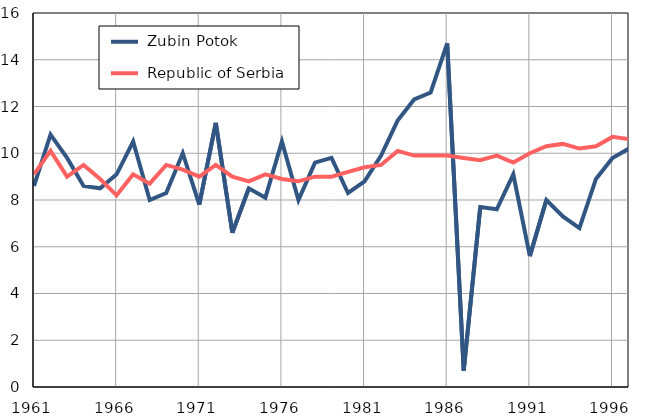
| Category |  Zubin Potok |  Republic of Serbia |
|---|---|---|
| 1961.0 | 8.6 | 9.1 |
| 1962.0 | 10.8 | 10.1 |
| 1963.0 | 9.8 | 9 |
| 1964.0 | 8.6 | 9.5 |
| 1965.0 | 8.5 | 8.9 |
| 1966.0 | 9.1 | 8.2 |
| 1967.0 | 10.5 | 9.1 |
| 1968.0 | 8 | 8.7 |
| 1969.0 | 8.3 | 9.5 |
| 1970.0 | 10 | 9.3 |
| 1971.0 | 7.8 | 9 |
| 1972.0 | 11.3 | 9.5 |
| 1973.0 | 6.6 | 9 |
| 1974.0 | 8.5 | 8.8 |
| 1975.0 | 8.1 | 9.1 |
| 1976.0 | 10.5 | 8.9 |
| 1977.0 | 8 | 8.8 |
| 1978.0 | 9.6 | 9 |
| 1979.0 | 9.8 | 9 |
| 1980.0 | 8.3 | 9.2 |
| 1981.0 | 8.8 | 9.4 |
| 1982.0 | 9.9 | 9.5 |
| 1983.0 | 11.4 | 10.1 |
| 1984.0 | 12.3 | 9.9 |
| 1985.0 | 12.6 | 9.9 |
| 1986.0 | 14.7 | 9.9 |
| 1987.0 | 0.7 | 9.8 |
| 1988.0 | 7.7 | 9.7 |
| 1989.0 | 7.6 | 9.9 |
| 1990.0 | 9.1 | 9.6 |
| 1991.0 | 5.6 | 10 |
| 1992.0 | 8 | 10.3 |
| 1993.0 | 7.3 | 10.4 |
| 1994.0 | 6.8 | 10.2 |
| 1995.0 | 8.9 | 10.3 |
| 1996.0 | 9.8 | 10.7 |
| 1997.0 | 10.2 | 10.6 |